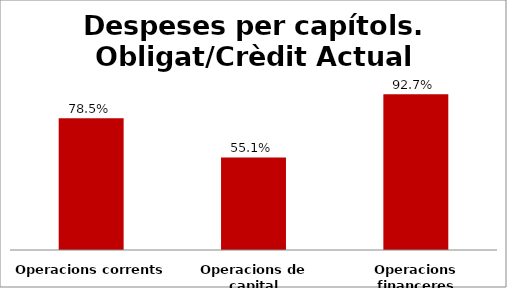
| Category | Series 0 |
|---|---|
| Operacions corrents | 0.785 |
| Operacions de capital | 0.551 |
| Operacions financeres | 0.927 |